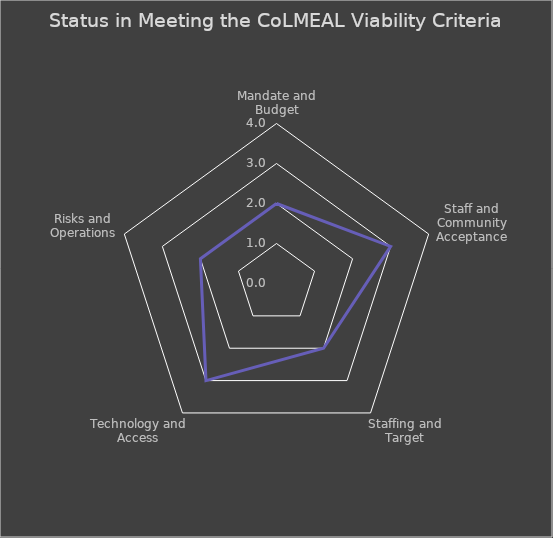
| Category | Series 0 |
|---|---|
| Mandate and Budget | 2 |
| Staff and Community Acceptance | 3 |
| Staffing and Target | 2 |
| Technology and Access | 3 |
| Risks and Operations | 2 |